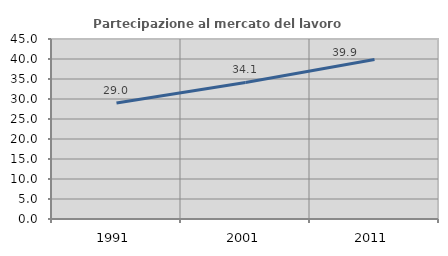
| Category | Partecipazione al mercato del lavoro  femminile |
|---|---|
| 1991.0 | 29.01 |
| 2001.0 | 34.146 |
| 2011.0 | 39.858 |